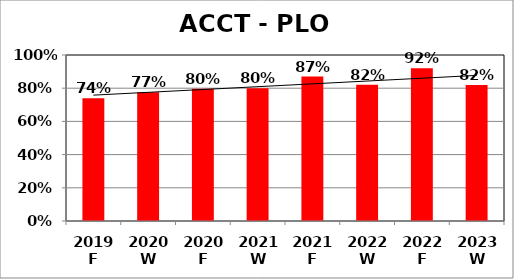
| Category | Series 0 |
|---|---|
| 2019 F | 0.74 |
| 2020 W | 0.775 |
| 2020 F | 0.796 |
| 2021 W | 0.8 |
| 2021 F | 0.87 |
| 2022 W | 0.82 |
| 2022 F | 0.92 |
| 2023 W | 0.82 |